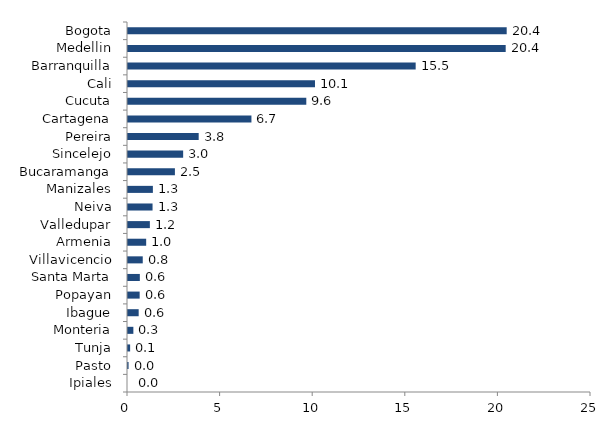
| Category | Series 0 |
|---|---|
| Ipiales | 0 |
| Pasto | 0.031 |
| Tunja | 0.115 |
| Monteria | 0.29 |
| Ibague | 0.577 |
| Popayan | 0.63 |
| Santa Marta | 0.639 |
| Villavicencio | 0.796 |
| Armenia | 0.981 |
| Valledupar | 1.181 |
| Neiva | 1.326 |
| Manizales | 1.343 |
| Bucaramanga | 2.533 |
| Sincelejo | 2.978 |
| Pereira | 3.817 |
| Cartagena | 6.665 |
| Cucuta | 9.627 |
| Cali | 10.097 |
| Barranquilla | 15.533 |
| Medellin | 20.394 |
| Bogota | 20.448 |